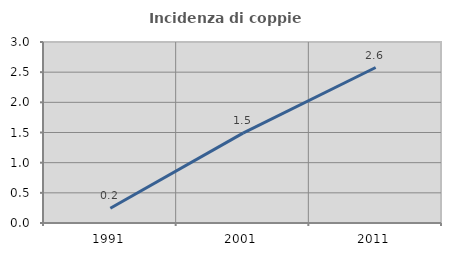
| Category | Incidenza di coppie miste |
|---|---|
| 1991.0 | 0.244 |
| 2001.0 | 1.489 |
| 2011.0 | 2.577 |